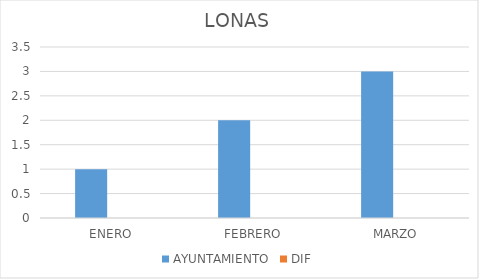
| Category | AYUNTAMIENTO | DIF |
|---|---|---|
| ENERO | 1 | 0 |
| FEBRERO | 2 | 0 |
| MARZO | 3 | 0 |